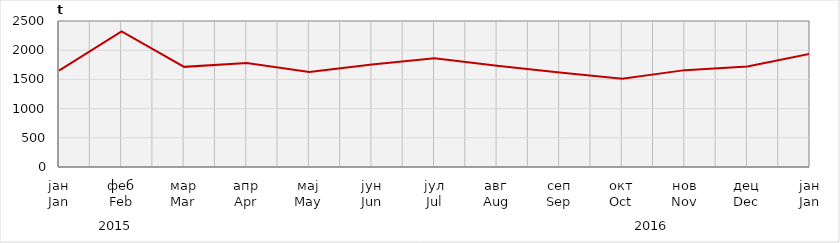
| Category | Нето тежина заклане стоке                              Net weight of  slaughtered livestock |
|---|---|
| јан
Jan | 1649074.16 |
| феб
Feb | 2321007.9 |
| мар
Mar | 1714725.6 |
| апр
Apr | 1780678.65 |
| мај
May | 1628212.69 |
| јун
Jun | 1753845.16 |
| јул
Jul | 1862492.5 |
| авг
Aug | 1733294.8 |
| сеп
Sep | 1619599 |
| окт
Oct | 1511667.7 |
| нов
Nov | 1658700 |
| дец
Dec | 1721996.5 |
| јан
Jan | 1938649.7 |